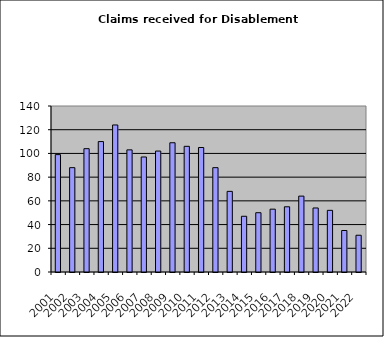
| Category | Series 1 |
|---|---|
| 2001.0 | 99 |
| 2002.0 | 88 |
| 2003.0 | 104 |
| 2004.0 | 110 |
| 2005.0 | 124 |
| 2006.0 | 103 |
| 2007.0 | 97 |
| 2008.0 | 102 |
| 2009.0 | 109 |
| 2010.0 | 106 |
| 2011.0 | 105 |
| 2012.0 | 88 |
| 2013.0 | 68 |
| 2014.0 | 47 |
| 2015.0 | 50 |
| 2016.0 | 53 |
| 2017.0 | 55 |
| 2018.0 | 64 |
| 2019.0 | 54 |
| 2020.0 | 52 |
| 2021.0 | 35 |
| 2022.0 | 31 |